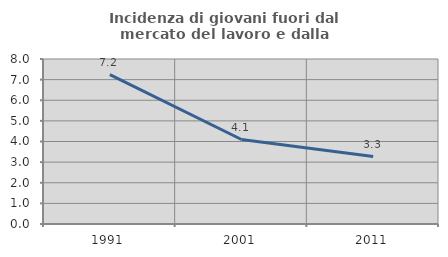
| Category | Incidenza di giovani fuori dal mercato del lavoro e dalla formazione  |
|---|---|
| 1991.0 | 7.242 |
| 2001.0 | 4.096 |
| 2011.0 | 3.273 |